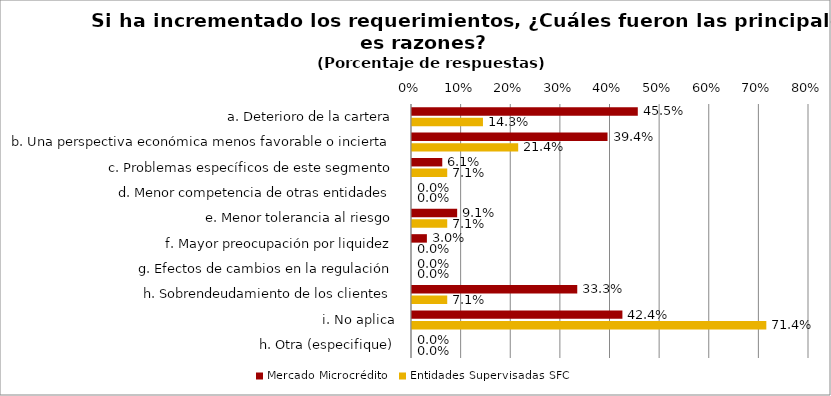
| Category | Mercado Microcrédito | Entidades Supervisadas SFC |
|---|---|---|
| a. Deterioro de la cartera | 0.455 | 0.143 |
| b. Una perspectiva económica menos favorable o incierta | 0.394 | 0.214 |
| c. Problemas específicos de este segmento | 0.061 | 0.071 |
| d. Menor competencia de otras entidades | 0 | 0 |
| e. Menor tolerancia al riesgo | 0.091 | 0.071 |
| f. Mayor preocupación por liquidez | 0.03 | 0 |
| g. Efectos de cambios en la regulación | 0 | 0 |
| h. Sobrendeudamiento de los clientes | 0.333 | 0.071 |
| i. No aplica | 0.424 | 0.714 |
| h. Otra (especifique) | 0 | 0 |